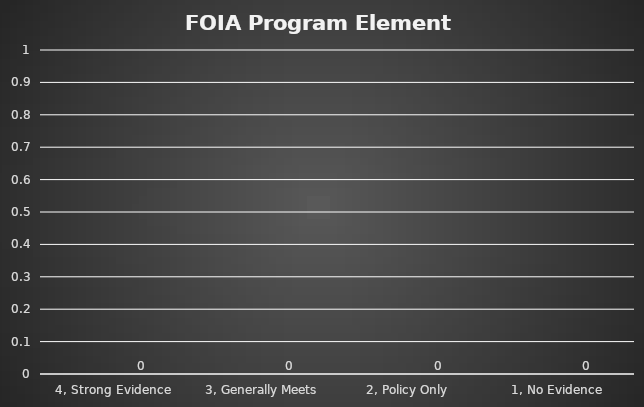
| Category | Series 0 | Total |
|---|---|---|
| 4, Strong Evidence |  | 0 |
| 3, Generally Meets |  | 0 |
| 2, Policy Only  |  | 0 |
| 1, No Evidence  |  | 0 |